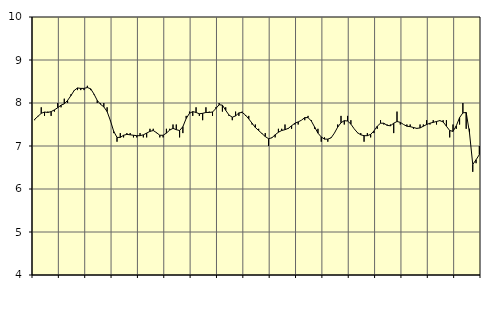
| Category | Piggar | Transport, SNI 49-53 |
|---|---|---|
| nan | 7.6 | 7.62 |
| 87.0 | 7.7 | 7.69 |
| 87.0 | 7.9 | 7.76 |
| 87.0 | 7.7 | 7.79 |
| nan | 7.8 | 7.78 |
| 88.0 | 7.7 | 7.8 |
| 88.0 | 7.8 | 7.84 |
| 88.0 | 8 | 7.89 |
| nan | 7.9 | 7.95 |
| 89.0 | 8.1 | 7.98 |
| 89.0 | 8 | 8.06 |
| 89.0 | 8.2 | 8.17 |
| nan | 8.3 | 8.29 |
| 90.0 | 8.3 | 8.35 |
| 90.0 | 8.3 | 8.34 |
| 90.0 | 8.3 | 8.34 |
| nan | 8.4 | 8.36 |
| 91.0 | 8.3 | 8.33 |
| 91.0 | 8.2 | 8.21 |
| 91.0 | 8 | 8.06 |
| nan | 8 | 7.97 |
| 92.0 | 8 | 7.91 |
| 92.0 | 7.9 | 7.8 |
| 92.0 | 7.6 | 7.59 |
| nan | 7.3 | 7.34 |
| 93.0 | 7.1 | 7.2 |
| 93.0 | 7.3 | 7.2 |
| 93.0 | 7.2 | 7.25 |
| nan | 7.3 | 7.27 |
| 94.0 | 7.3 | 7.26 |
| 94.0 | 7.2 | 7.25 |
| 94.0 | 7.2 | 7.24 |
| nan | 7.3 | 7.24 |
| 95.0 | 7.2 | 7.26 |
| 95.0 | 7.2 | 7.3 |
| 95.0 | 7.4 | 7.34 |
| nan | 7.4 | 7.36 |
| 96.0 | 7.3 | 7.31 |
| 96.0 | 7.2 | 7.25 |
| 96.0 | 7.2 | 7.25 |
| nan | 7.4 | 7.3 |
| 97.0 | 7.4 | 7.37 |
| 97.0 | 7.5 | 7.41 |
| 97.0 | 7.5 | 7.38 |
| nan | 7.2 | 7.36 |
| 98.0 | 7.3 | 7.45 |
| 98.0 | 7.7 | 7.64 |
| 98.0 | 7.8 | 7.76 |
| nan | 7.7 | 7.8 |
| 99.0 | 7.9 | 7.78 |
| 99.0 | 7.7 | 7.75 |
| 99.0 | 7.6 | 7.76 |
| nan | 7.9 | 7.78 |
| 0.0 | 7.8 | 7.78 |
| 0.0 | 7.7 | 7.79 |
| 0.0 | 7.9 | 7.87 |
| nan | 8 | 7.96 |
| 1.0 | 7.8 | 7.95 |
| 1.0 | 7.9 | 7.83 |
| 1.0 | 7.7 | 7.72 |
| nan | 7.6 | 7.67 |
| 2.0 | 7.8 | 7.7 |
| 2.0 | 7.7 | 7.77 |
| 2.0 | 7.8 | 7.78 |
| nan | 7.7 | 7.72 |
| 3.0 | 7.7 | 7.63 |
| 3.0 | 7.5 | 7.53 |
| 3.0 | 7.5 | 7.43 |
| nan | 7.4 | 7.36 |
| 4.0 | 7.3 | 7.29 |
| 4.0 | 7.3 | 7.22 |
| 4.0 | 7 | 7.17 |
| nan | 7.2 | 7.19 |
| 5.0 | 7.2 | 7.26 |
| 5.0 | 7.4 | 7.32 |
| 5.0 | 7.4 | 7.36 |
| nan | 7.5 | 7.38 |
| 6.0 | 7.4 | 7.41 |
| 6.0 | 7.4 | 7.47 |
| 6.0 | 7.5 | 7.53 |
| nan | 7.5 | 7.56 |
| 7.0 | 7.6 | 7.6 |
| 7.0 | 7.6 | 7.66 |
| 7.0 | 7.7 | 7.66 |
| nan | 7.6 | 7.58 |
| 8.0 | 7.4 | 7.44 |
| 8.0 | 7.4 | 7.3 |
| 8.0 | 7.1 | 7.21 |
| nan | 7.2 | 7.16 |
| 9.0 | 7.1 | 7.16 |
| 9.0 | 7.2 | 7.19 |
| 9.0 | 7.3 | 7.3 |
| nan | 7.5 | 7.44 |
| 10.0 | 7.7 | 7.54 |
| 10.0 | 7.5 | 7.59 |
| 10.0 | 7.7 | 7.58 |
| nan | 7.6 | 7.51 |
| 11.0 | 7.4 | 7.4 |
| 11.0 | 7.3 | 7.31 |
| 11.0 | 7.3 | 7.26 |
| nan | 7.1 | 7.24 |
| 12.0 | 7.3 | 7.24 |
| 12.0 | 7.2 | 7.27 |
| 12.0 | 7.3 | 7.35 |
| nan | 7.4 | 7.46 |
| 13.0 | 7.6 | 7.53 |
| 13.0 | 7.5 | 7.53 |
| 13.0 | 7.5 | 7.48 |
| nan | 7.5 | 7.47 |
| 14.0 | 7.3 | 7.53 |
| 14.0 | 7.8 | 7.57 |
| 14.0 | 7.5 | 7.55 |
| nan | 7.5 | 7.5 |
| 15.0 | 7.5 | 7.46 |
| 15.0 | 7.5 | 7.45 |
| 15.0 | 7.4 | 7.43 |
| nan | 7.4 | 7.41 |
| 16.0 | 7.5 | 7.42 |
| 16.0 | 7.5 | 7.46 |
| 16.0 | 7.6 | 7.5 |
| nan | 7.5 | 7.53 |
| 17.0 | 7.6 | 7.55 |
| 17.0 | 7.5 | 7.57 |
| 17.0 | 7.6 | 7.59 |
| nan | 7.6 | 7.56 |
| 18.0 | 7.6 | 7.46 |
| 18.0 | 7.2 | 7.36 |
| 18.0 | 7.5 | 7.34 |
| nan | 7.4 | 7.47 |
| 19.0 | 7.5 | 7.66 |
| 19.0 | 8 | 7.77 |
| 19.0 | 7.4 | 7.78 |
| nan | 7.4 | 7.31 |
| 20.0 | 6.4 | 6.57 |
| 20.0 | 6.6 | 6.68 |
| 20.0 | 7 | 6.8 |